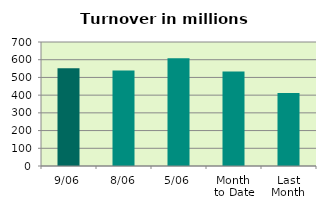
| Category | Series 0 |
|---|---|
| 9/06 | 551.291 |
| 8/06 | 539.151 |
| 5/06 | 608.632 |
| Month 
to Date | 534.103 |
| Last
Month | 412.236 |